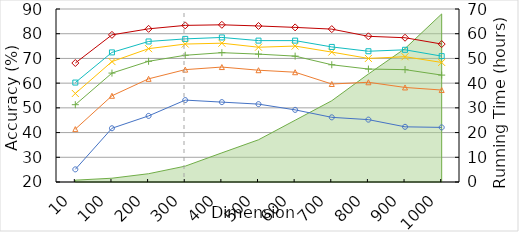
| Category | Top 1 | Top 2 | Top 3 |   | Top 4 | Top 5 | Top 10 |
|---|---|---|---|---|---|---|---|
| 10.0 | 25.116 | 41.395 | 51.279 |  | 55.814 | 60.233 | 68.14 |
| 100.0 | 41.744 | 54.884 | 64.07 |  | 68.721 | 72.442 | 79.535 |
| 200.0 | 46.744 | 61.744 | 68.837 |  | 73.953 | 76.86 | 81.977 |
| 300.0 | 53.14 | 65.465 | 71.279 |  | 75.814 | 77.907 | 83.372 |
| 400.0 | 52.326 | 66.512 | 72.326 |  | 76.163 | 78.488 | 83.605 |
| 500.0 | 51.512 | 65.233 | 71.744 |  | 74.535 | 77.209 | 83.14 |
| 600.0 | 49.186 | 64.419 | 70.93 |  | 75 | 77.209 | 82.558 |
| 700.0 | 46.163 | 59.651 | 67.442 |  | 72.558 | 74.651 | 81.86 |
| 800.0 | 45.233 | 60.349 | 65.698 |  | 70 | 72.907 | 78.953 |
| 900.0 | 42.326 | 58.256 | 65.465 |  | 70.698 | 73.488 | 78.372 |
| 1000.0 | 42.093 | 57.209 | 63.256 |  | 68.372 | 70.93 | 75.814 |